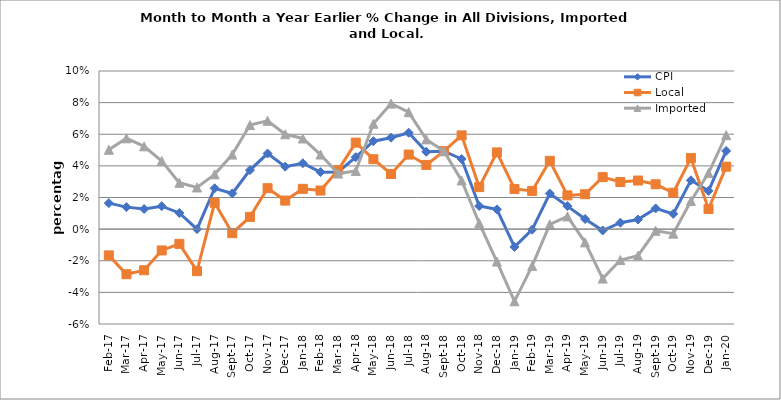
| Category | CPI | Local | Imported |
|---|---|---|---|
| 2017-02-01 | 0.016 | -0.017 | 0.05 |
| 2017-03-01 | 0.014 | -0.029 | 0.057 |
| 2017-04-01 | 0.013 | -0.026 | 0.052 |
| 2017-05-01 | 0.015 | -0.013 | 0.043 |
| 2017-06-01 | 0.01 | -0.009 | 0.029 |
| 2017-07-01 | 0 | -0.027 | 0.026 |
| 2017-08-01 | 0.026 | 0.017 | 0.035 |
| 2017-09-01 | 0.023 | -0.003 | 0.047 |
| 2017-10-01 | 0.037 | 0.008 | 0.066 |
| 2017-11-01 | 0.048 | 0.026 | 0.069 |
| 2017-12-01 | 0.04 | 0.018 | 0.06 |
| 2018-01-01 | 0.042 | 0.025 | 0.057 |
| 2018-02-01 | 0.036 | 0.024 | 0.047 |
| 2018-03-01 | 0.036 | 0.037 | 0.035 |
| 2018-04-01 | 0.045 | 0.055 | 0.037 |
| 2018-05-01 | 0.056 | 0.044 | 0.067 |
| 2018-06-01 | 0.058 | 0.035 | 0.079 |
| 2018-07-01 | 0.061 | 0.047 | 0.074 |
| 2018-08-01 | 0.049 | 0.041 | 0.057 |
| 2018-09-01 | 0.049 | 0.049 | 0.049 |
| 2018-10-01 | 0.044 | 0.059 | 0.031 |
| 2018-11-01 | 0.015 | 0.027 | 0.004 |
| 2018-12-01 | 0.012 | 0.049 | -0.021 |
| 2019-01-01 | -0.011 | 0.025 | -0.046 |
| 2019-02-01 | 0 | 0.024 | -0.023 |
| 2019-03-01 | 0.023 | 0.043 | 0.003 |
| 2019-04-01 | 0.015 | 0.021 | 0.008 |
| 2019-05-01 | 0.006 | 0.022 | -0.008 |
| 2019-06-01 | -0.001 | 0.033 | -0.031 |
| 2019-07-01 | 0.004 | 0.03 | -0.02 |
| 2019-08-01 | 0.006 | 0.031 | -0.017 |
| 2019-09-01 | 0.013 | 0.028 | -0.001 |
| 2019-10-01 | 0.01 | 0.023 | -0.003 |
| 2019-11-01 | 0.031 | 0.045 | 0.018 |
| 2019-12-01 | 0.024 | 0.013 | 0.035 |
| 2020-01-01 | 0.049 | 0.039 | 0.059 |